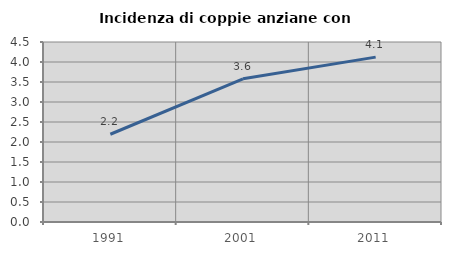
| Category | Incidenza di coppie anziane con figli |
|---|---|
| 1991.0 | 2.194 |
| 2001.0 | 3.579 |
| 2011.0 | 4.122 |